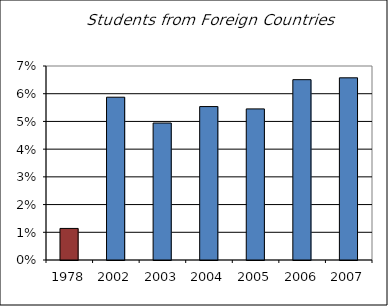
| Category | Foreign Countries |
|---|---|
| 1978.0 | 0.011 |
| 2002.0 | 0.059 |
| 2003.0 | 0.049 |
| 2004.0 | 0.055 |
| 2005.0 | 0.055 |
| 2006.0 | 0.065 |
| 2007.0 | 0.066 |